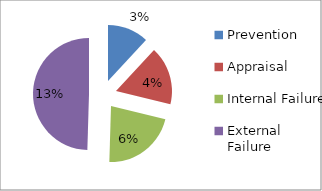
| Category | Series 0 | Series 1 | Series 2 |
|---|---|---|---|
| Prevention | 0.031 | 0.078 | 0.031 |
| Appraisal | 0.044 | 0.085 | 0.044 |
| Internal Failure | 0.056 | 0.087 | 0.056 |
| External Failure | 0.129 | 0.209 | 0.129 |